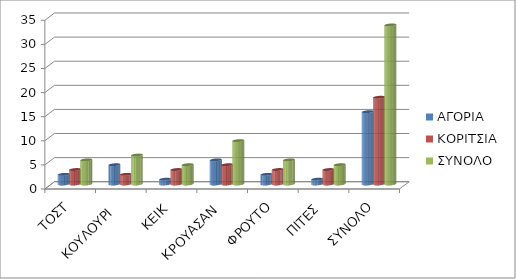
| Category | ΑΓΟΡΙΑ | ΚΟΡΙΤΣΙΑ | ΣΥΝΟΛΟ |
|---|---|---|---|
| ΤΟΣΤ | 2 | 3 | 5 |
| ΚΟΥΛΟΥΡΙ  | 4 | 2 | 6 |
| ΚΕΙΚ | 1 | 3 | 4 |
| ΚΡΟΥΑΣΑΝ | 5 | 4 | 9 |
| ΦΡΟΥΤΟ | 2 | 3 | 5 |
| ΠΙΤΕΣ | 1 | 3 | 4 |
| ΣΥΝΟΛΟ | 15 | 18 | 33 |